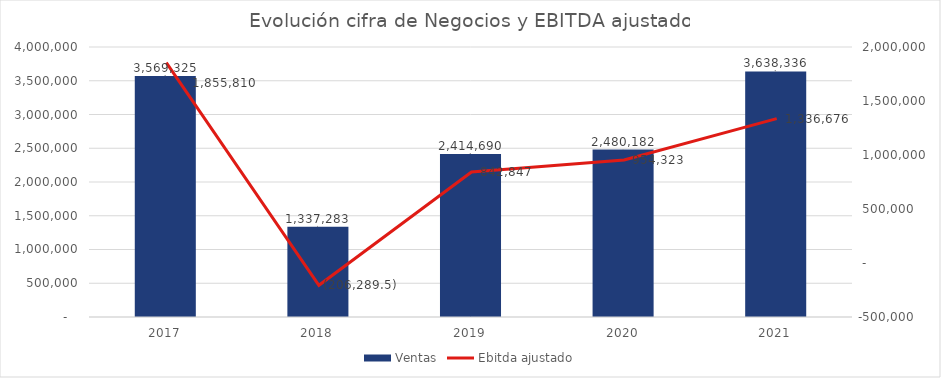
| Category | Ventas |
|---|---|
| 2017.0 | 3569325.38 |
| 2018.0 | 1337283.46 |
| 2019.0 | 2414689.79 |
| 2020.0 | 2480181.95 |
| 2021.0 | 3638336.38 |